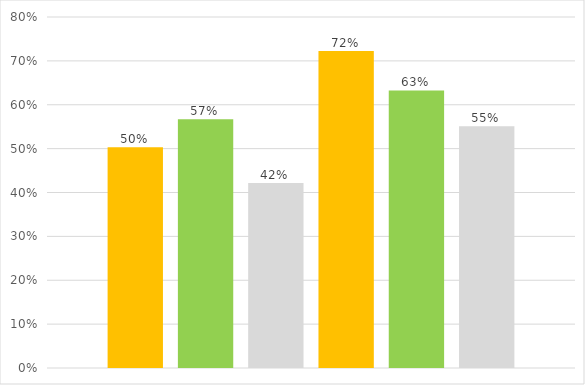
| Category | Series 0 | Series 1 | Series 2 | Series 3 | Series 4 | Series 5 |
|---|---|---|---|---|---|---|
| 0 | 0.503 | 0.567 | 0.421 | 0.723 | 0.633 | 0.551 |